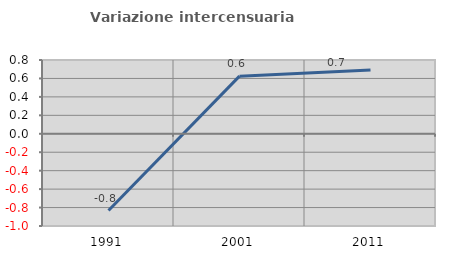
| Category | Variazione intercensuaria annua |
|---|---|
| 1991.0 | -0.833 |
| 2001.0 | 0.625 |
| 2011.0 | 0.692 |